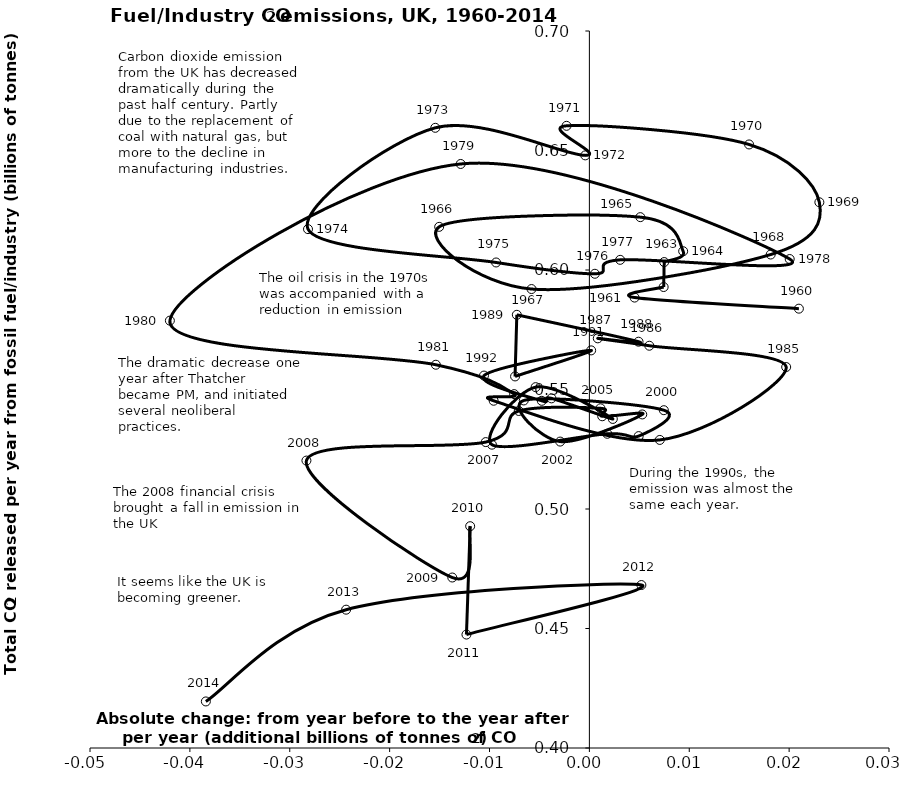
| Category | Series 0 |
|---|---|
| 0.020978231999999986 | 0.584 |
| 0.004526872000000015 | 0.588 |
| 0.007436088000000007 | 0.593 |
| 0.007491047999999945 | 0.603 |
| 0.00939083199999996 | 0.608 |
| 0.005100288000000008 | 0.622 |
| -0.015038887999999973 | 0.618 |
| -0.005792783999999995 | 0.592 |
| 0.018155120000000025 | 0.606 |
| 0.023028239999999978 | 0.628 |
| 0.015989695999999942 | 0.653 |
| -0.002286336 | 0.66 |
| -0.0004140320000000086 | 0.648 |
| -0.015427271999999992 | 0.659 |
| -0.028172495999999936 | 0.617 |
| -0.009339535999999982 | 0.603 |
| 0.0005514319999999628 | 0.598 |
| 0.0030832559999999787 | 0.604 |
| 0.02005673600000002 | 0.605 |
| -0.012886287999999968 | 0.644 |
| -0.04200226400000001 | 0.579 |
| -0.015372312000000055 | 0.56 |
| -0.007533183999999971 | 0.548 |
| -0.009585023999999942 | 0.545 |
| 0.007051368000000002 | 0.529 |
| 0.019704991999999977 | 0.559 |
| 0.006001631999999979 | 0.568 |
| 0.000842720000000019 | 0.571 |
| 0.004922584000000008 | 0.57 |
| -0.007263880000000056 | 0.581 |
| -0.007439752000000022 | 0.555 |
| 0.00017770400000005626 | 0.566 |
| -0.010550487999999969 | 0.556 |
| -0.004766863999999982 | 0.545 |
| -0.003794072000000037 | 0.546 |
| 0.0023467919999999864 | 0.538 |
| -0.005382416000000001 | 0.551 |
| -0.00975723200000006 | 0.527 |
| 0.0017953600000000236 | 0.531 |
| 0.00493540800000003 | 0.531 |
| 0.007456239999999947 | 0.541 |
| -0.006565887999999964 | 0.545 |
| -0.0029257039999999734 | 0.528 |
| 0.005294479999999935 | 0.54 |
| 0.0012860640000000312 | 0.539 |
| 0.001108360000000086 | 0.542 |
| -0.007071519999999998 | 0.541 |
| -0.010376448000000038 | 0.528 |
| -0.028330048000000024 | 0.52 |
| -0.013729007999999987 | 0.471 |
| -0.011935479999999998 | 0.493 |
| -0.012307376000000009 | 0.447 |
| 0.00520654399999998 | 0.468 |
| -0.024356440000000007 | 0.458 |
| -0.03839871999999994 | 0.419 |